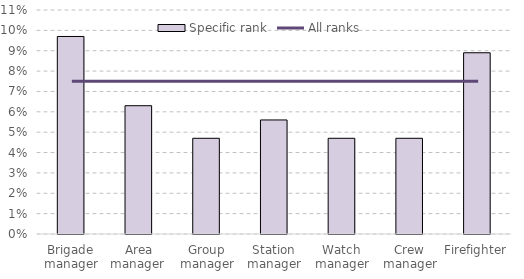
| Category | Specific rank |
|---|---|
| Brigade manager | 0.097 |
| Area manager  | 0.063 |
| Group manager | 0.047 |
| Station manager | 0.056 |
| Watch manager | 0.047 |
| Crew manager | 0.047 |
| Firefighter | 0.089 |